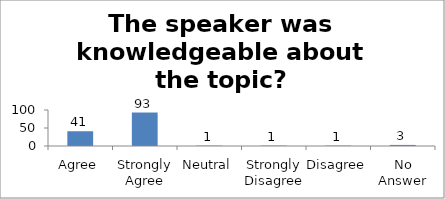
| Category | The speaker was knowledgeable about the topic? |
|---|---|
| Agree | 41 |
| Strongly Agree | 93 |
| Neutral | 1 |
| Strongly Disagree | 1 |
| Disagree | 1 |
| No Answer | 3 |